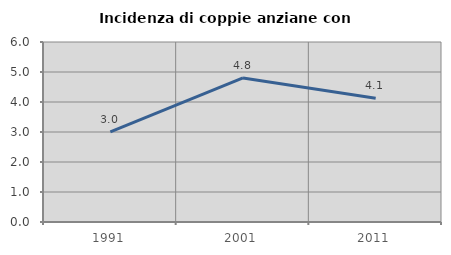
| Category | Incidenza di coppie anziane con figli |
|---|---|
| 1991.0 | 3.002 |
| 2001.0 | 4.802 |
| 2011.0 | 4.128 |